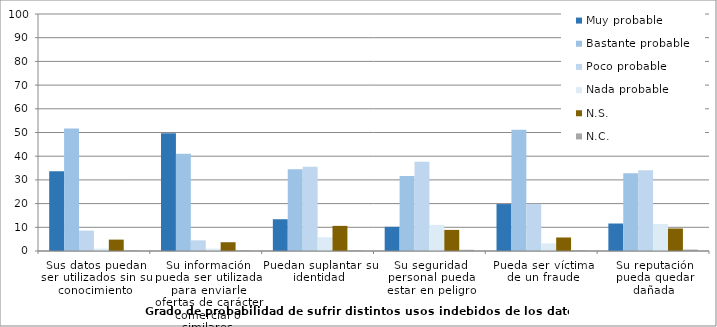
| Category | Muy probable | Bastante probable | Poco probable | Nada probable | N.S. | N.C. |
|---|---|---|---|---|---|---|
| Sus datos puedan ser utilizados sin su conocimiento | 33.7 | 51.7 | 8.6 | 1 | 4.8 | 0.2 |
| Su información pueda ser utilizada para enviarle ofertas de carácter comercial o similares | 49.7 | 41 | 4.5 | 1 | 3.7 | 0.2 |
| Puedan suplantar su identidad | 13.4 | 34.5 | 35.5 | 5.8 | 10.6 | 0.2 |
| Su seguridad personal pueda estar en peligro | 10.2 | 31.6 | 37.7 | 11 | 8.9 | 0.5 |
| Pueda ser víctima de un fraude | 19.8 | 51.2 | 19.9 | 3.2 | 5.7 | 0.2 |
| Su reputación pueda quedar dañada | 11.6 | 32.8 | 34.1 | 11.4 | 9.5 | 0.6 |